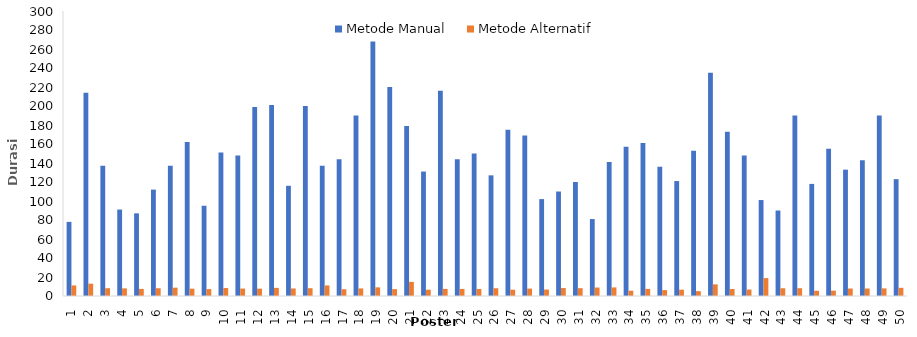
| Category | Metode Manual | Metode Alternatif |
|---|---|---|
| 1 | 78 | 11.12 |
| 2 | 214 | 12.96 |
| 3 | 137 | 8.22 |
| 4 | 91 | 8.02 |
| 5 | 87 | 7.47 |
| 6 | 112 | 8.16 |
| 7 | 137 | 8.76 |
| 8 | 162 | 7.71 |
| 9 | 95 | 7.27 |
| 10 | 151 | 8.39 |
| 11 | 148 | 7.84 |
| 12 | 199 | 7.75 |
| 13 | 201 | 8.56 |
| 14 | 116 | 7.94 |
| 15 | 200 | 8.21 |
| 16 | 137 | 11.12 |
| 17 | 144 | 7.14 |
| 18 | 190 | 7.99 |
| 19 | 268 | 9.11 |
| 20 | 220 | 7.23 |
| 21 | 179 | 14.87 |
| 22 | 131 | 6.62 |
| 23 | 216 | 7.48 |
| 24 | 144 | 7.46 |
| 25 | 150 | 7.44 |
| 26 | 127 | 8.19 |
| 27 | 175 | 6.64 |
| 28 | 169 | 7.8 |
| 29 | 102 | 6.81 |
| 30 | 110 | 8.37 |
| 31 | 120 | 8.23 |
| 32 | 81 | 8.91 |
| 33 | 141 | 9.03 |
| 34 | 157 | 5.58 |
| 35 | 161 | 7.5 |
| 36 | 136 | 6.2 |
| 37 | 121 | 6.66 |
| 38 | 153 | 5.09 |
| 39 | 235 | 12.21 |
| 40 | 173 | 7.38 |
| 41 | 148 | 6.8 |
| 42 | 101 | 18.85 |
| 43 | 90 | 8.16 |
| 44 | 190 | 8.19 |
| 45 | 118 | 5.5 |
| 46 | 155 | 5.63 |
| 47 | 133 | 7.87 |
| 48 | 143 | 7.9 |
| 49 | 190 | 8.01 |
| 50 | 123 | 8.61 |